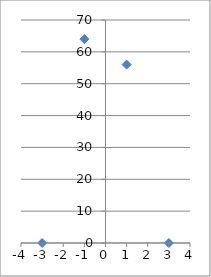
| Category | Series 0 |
|---|---|
| -3.0 | 0 |
| 3.0 | 0 |
| -1.0 | 64 |
| 1.0 | 56 |